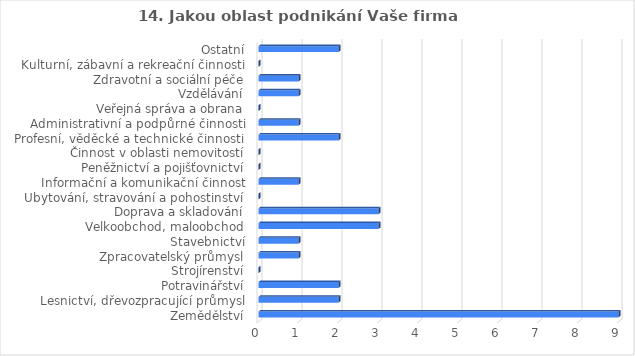
| Category | Series 0 |
|---|---|
| Zemědělství | 9 |
| Lesnictví, dřevozpracující průmysl | 2 |
| Potravinářství | 2 |
| Strojírenství | 0 |
| Zpracovatelský průmysl | 1 |
| Stavebnictví | 1 |
| Velkoobchod, maloobchod | 3 |
| Doprava a skladování | 3 |
| Ubytování, stravování a pohostinství | 0 |
| Informační a komunikační činnost | 1 |
| Peněžnictví a pojišťovnictví | 0 |
| Činnost v oblasti nemovitostí | 0 |
| Profesní, věděcké a technické činnosti | 2 |
| Administrativní a podpůrné činnosti | 1 |
| Veřejná správa a obrana | 0 |
| Vzdělávání | 1 |
| Zdravotní a sociální péče | 1 |
| Kulturní, zábavní a rekreační činnosti | 0 |
| Ostatní | 2 |